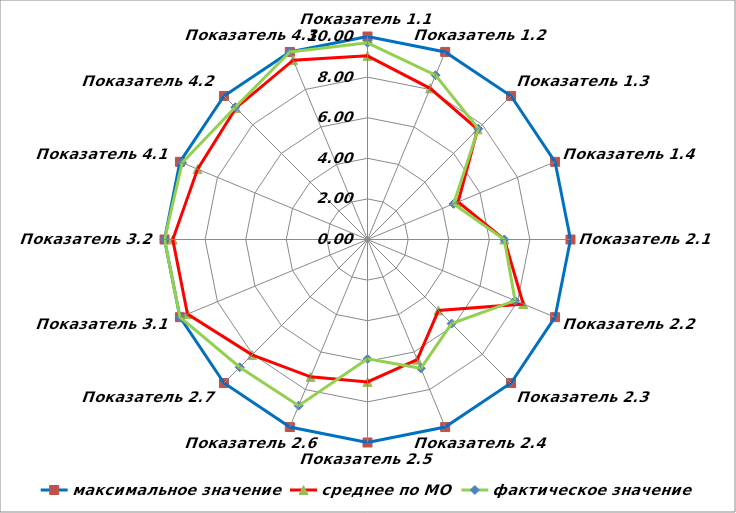
| Category | максимальное значение | среднее по МО | фактическое значение |
|---|---|---|---|
| Показатель 1.1 | 10 | 9.046 | 9.69 |
| Показатель 1.2 | 10 | 8.061 | 8.76 |
| Показатель 1.3 | 10 | 7.673 | 7.72 |
| Показатель 1.4 | 10 | 4.833 | 4.59 |
| Показатель 2.1 | 10 | 6.745 | 6.74 |
| Показатель 2.2 | 10 | 8.305 | 7.87 |
| Показатель 2.3 | 10 | 4.943 | 5.86 |
| Показатель 2.4 | 10 | 6.405 | 6.87 |
| Показатель 2.5 | 10 | 7.017 | 5.88 |
| Показатель 2.6 | 10 | 7.323 | 8.86 |
| Показатель 2.7 | 10 | 8.039 | 8.9 |
| Показатель 3.1 | 10 | 9.599 | 10 |
| Показатель 3.2 | 10 | 9.593 | 10 |
| Показатель 4.1 | 10 | 9.059 | 9.88 |
| Показатель 4.2 | 10 | 9.164 | 9.21 |
| Показатель 4.3 | 10 | 9.561 | 10 |